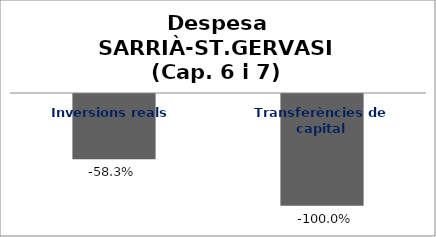
| Category | Series 0 |
|---|---|
| Inversions reals | -0.583 |
| Transferències de capital | -1 |